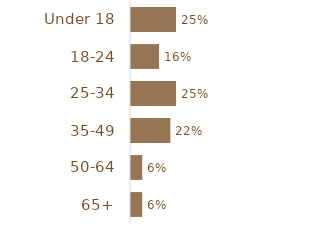
| Category | Total |
|---|---|
| Under 18 | 0.25 |
|  18-24 | 0.156 |
|  25-34 | 0.25 |
|  35-49 | 0.219 |
|  50-64 | 0.062 |
|  65+ | 0.062 |